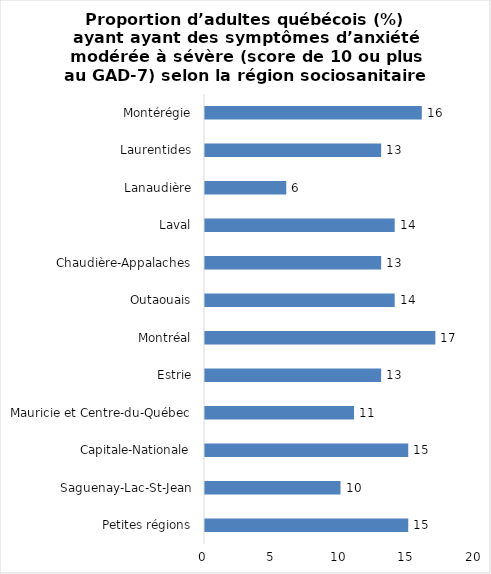
| Category | Series 0 |
|---|---|
| Petites régions | 15 |
| Saguenay-Lac-St-Jean | 10 |
| Capitale-Nationale | 15 |
| Mauricie et Centre-du-Québec | 11 |
| Estrie | 13 |
| Montréal | 17 |
| Outaouais | 14 |
| Chaudière-Appalaches | 13 |
| Laval | 14 |
| Lanaudière | 6 |
| Laurentides | 13 |
| Montérégie | 16 |